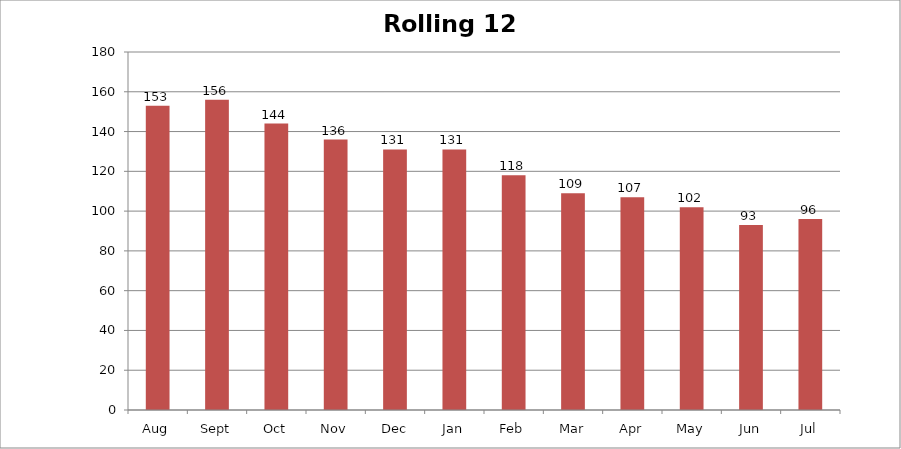
| Category | Rolling 12 Month |
|---|---|
| Aug | 153 |
| Sept | 156 |
| Oct | 144 |
| Nov | 136 |
| Dec | 131 |
| Jan | 131 |
| Feb | 118 |
| Mar | 109 |
| Apr | 107 |
| May | 102 |
| Jun | 93 |
| Jul | 96 |